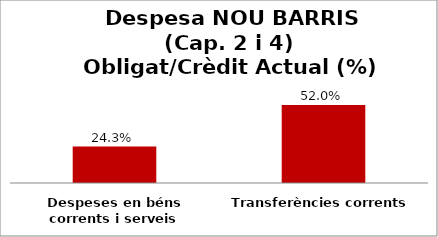
| Category | Series 0 |
|---|---|
| Despeses en béns corrents i serveis | 0.243 |
| Transferències corrents | 0.52 |